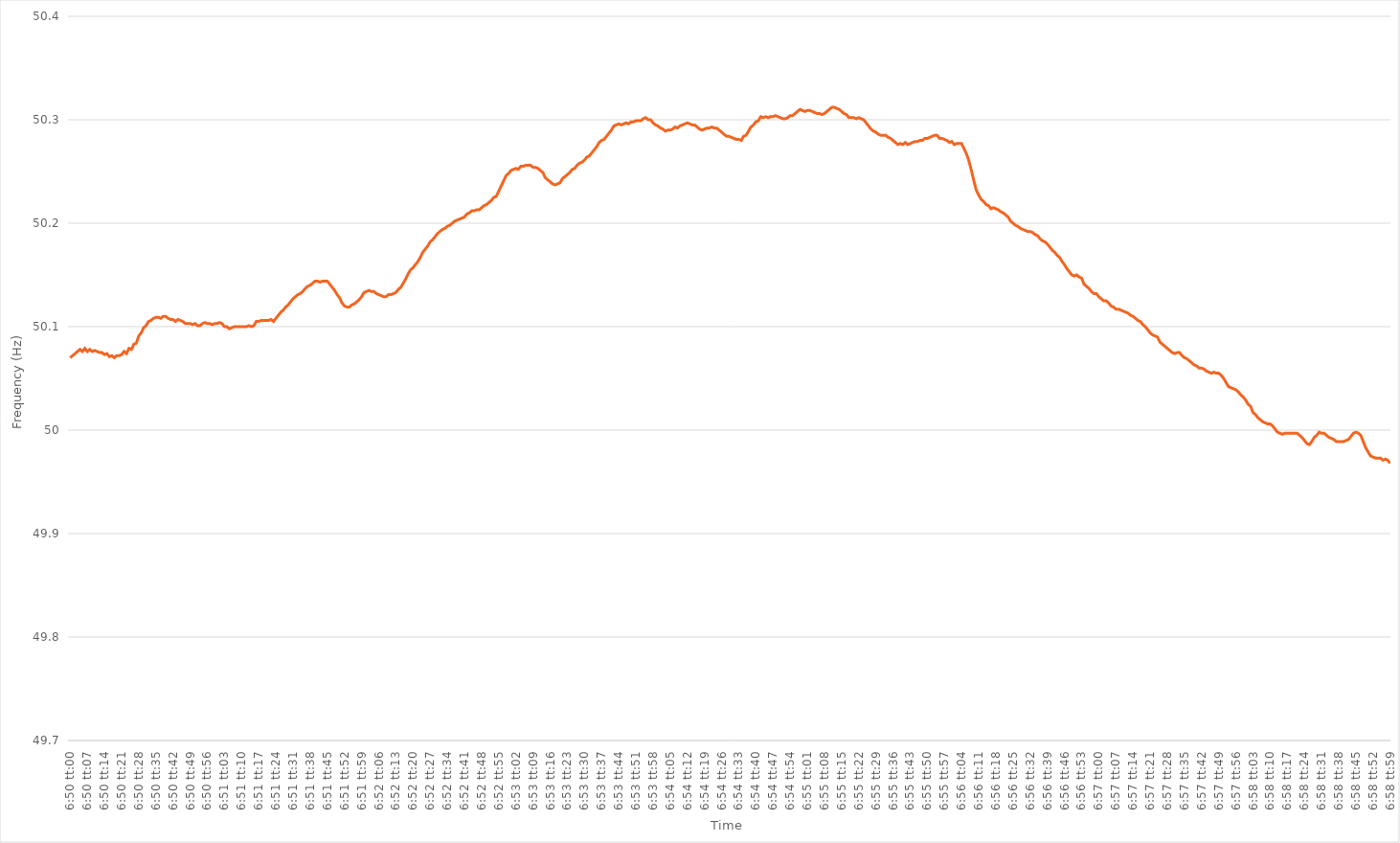
| Category | Series 0 |
|---|---|
| 0.2847222222222222 | 50.07 |
| 0.2847337962962963 | 50.072 |
| 0.28474537037037034 | 50.074 |
| 0.28475694444444444 | 50.076 |
| 0.28476851851851853 | 50.078 |
| 0.28478009259259257 | 50.076 |
| 0.28479166666666667 | 50.079 |
| 0.28480324074074076 | 50.076 |
| 0.2848148148148148 | 50.078 |
| 0.2848263888888889 | 50.076 |
| 0.284837962962963 | 50.077 |
| 0.284849537037037 | 50.076 |
| 0.2848611111111111 | 50.075 |
| 0.2848726851851852 | 50.075 |
| 0.28488425925925925 | 50.073 |
| 0.28489583333333335 | 50.074 |
| 0.2849074074074074 | 50.071 |
| 0.2849189814814815 | 50.072 |
| 0.2849305555555555 | 50.07 |
| 0.28494212962962967 | 50.072 |
| 0.2849537037037037 | 50.072 |
| 0.28496527777777775 | 50.073 |
| 0.28497685185185184 | 50.076 |
| 0.28498842592592594 | 50.074 |
| 0.285 | 50.079 |
| 0.28501157407407407 | 50.078 |
| 0.28502314814814816 | 50.083 |
| 0.2850347222222222 | 50.084 |
| 0.2850462962962963 | 50.091 |
| 0.2850578703703704 | 50.094 |
| 0.28506944444444443 | 50.099 |
| 0.2850810185185185 | 50.101 |
| 0.2850925925925926 | 50.105 |
| 0.28510416666666666 | 50.106 |
| 0.28511574074074075 | 50.108 |
| 0.28512731481481485 | 50.109 |
| 0.2851388888888889 | 50.109 |
| 0.2851504629629629 | 50.108 |
| 0.2851620370370371 | 50.11 |
| 0.2851736111111111 | 50.11 |
| 0.28518518518518515 | 50.108 |
| 0.28519675925925925 | 50.107 |
| 0.28520833333333334 | 50.107 |
| 0.2852199074074074 | 50.105 |
| 0.2852314814814815 | 50.107 |
| 0.28524305555555557 | 50.106 |
| 0.2852546296296296 | 50.105 |
| 0.2852662037037037 | 50.103 |
| 0.2852777777777778 | 50.103 |
| 0.28528935185185184 | 50.103 |
| 0.28530092592592593 | 50.102 |
| 0.2853125 | 50.103 |
| 0.28532407407407406 | 50.101 |
| 0.28533564814814816 | 50.101 |
| 0.28534722222222225 | 50.103 |
| 0.2853587962962963 | 50.104 |
| 0.28537037037037033 | 50.103 |
| 0.2853819444444445 | 50.103 |
| 0.2853935185185185 | 50.102 |
| 0.2854050925925926 | 50.103 |
| 0.28541666666666665 | 50.103 |
| 0.28542824074074075 | 50.104 |
| 0.2854398148148148 | 50.103 |
| 0.2854513888888889 | 50.1 |
| 0.285462962962963 | 50.1 |
| 0.285474537037037 | 50.098 |
| 0.2854861111111111 | 50.099 |
| 0.2854976851851852 | 50.1 |
| 0.28550925925925924 | 50.1 |
| 0.28552083333333333 | 50.1 |
| 0.28553240740740743 | 50.1 |
| 0.28554398148148147 | 50.1 |
| 0.28555555555555556 | 50.1 |
| 0.28556712962962966 | 50.101 |
| 0.2855787037037037 | 50.1 |
| 0.2855902777777778 | 50.101 |
| 0.2856018518518519 | 50.105 |
| 0.2856134259259259 | 50.105 |
| 0.285625 | 50.106 |
| 0.28563657407407406 | 50.106 |
| 0.28564814814814815 | 50.106 |
| 0.2856597222222222 | 50.106 |
| 0.2856712962962963 | 50.107 |
| 0.2856828703703704 | 50.105 |
| 0.2856944444444444 | 50.108 |
| 0.2857060185185185 | 50.111 |
| 0.2857175925925926 | 50.114 |
| 0.28572916666666665 | 50.116 |
| 0.28574074074074074 | 50.119 |
| 0.28575231481481483 | 50.121 |
| 0.2857638888888889 | 50.124 |
| 0.28577546296296297 | 50.127 |
| 0.28578703703703706 | 50.129 |
| 0.2857986111111111 | 50.131 |
| 0.2858101851851852 | 50.132 |
| 0.2858217592592593 | 50.134 |
| 0.28583333333333333 | 50.137 |
| 0.2858449074074074 | 50.139 |
| 0.28585648148148146 | 50.14 |
| 0.28586805555555556 | 50.142 |
| 0.2858796296296296 | 50.144 |
| 0.2858912037037037 | 50.144 |
| 0.2859027777777778 | 50.143 |
| 0.2859143518518518 | 50.144 |
| 0.2859259259259259 | 50.144 |
| 0.2859375 | 50.144 |
| 0.28594907407407405 | 50.141 |
| 0.28596064814814814 | 50.138 |
| 0.28597222222222224 | 50.135 |
| 0.2859837962962963 | 50.131 |
| 0.28599537037037037 | 50.128 |
| 0.28600694444444447 | 50.123 |
| 0.2860185185185185 | 50.12 |
| 0.2860300925925926 | 50.119 |
| 0.2860416666666667 | 50.119 |
| 0.28605324074074073 | 50.121 |
| 0.2860648148148148 | 50.122 |
| 0.2860763888888889 | 50.124 |
| 0.28608796296296296 | 50.126 |
| 0.286099537037037 | 50.129 |
| 0.28611111111111115 | 50.133 |
| 0.2861226851851852 | 50.134 |
| 0.2861342592592592 | 50.135 |
| 0.2861458333333333 | 50.134 |
| 0.2861574074074074 | 50.134 |
| 0.28616898148148145 | 50.132 |
| 0.28618055555555555 | 50.131 |
| 0.28619212962962964 | 50.13 |
| 0.2862037037037037 | 50.129 |
| 0.2862152777777778 | 50.129 |
| 0.28622685185185187 | 50.131 |
| 0.2862384259259259 | 50.131 |
| 0.28625 | 50.132 |
| 0.2862615740740741 | 50.133 |
| 0.28627314814814814 | 50.136 |
| 0.28628472222222223 | 50.138 |
| 0.2862962962962963 | 50.142 |
| 0.28630787037037037 | 50.146 |
| 0.2863194444444444 | 50.151 |
| 0.28633101851851855 | 50.155 |
| 0.2863425925925926 | 50.157 |
| 0.2863541666666667 | 50.16 |
| 0.2863657407407407 | 50.163 |
| 0.2863773148148148 | 50.167 |
| 0.28638888888888886 | 50.172 |
| 0.28640046296296295 | 50.175 |
| 0.28641203703703705 | 50.178 |
| 0.2864236111111111 | 50.182 |
| 0.2864351851851852 | 50.184 |
| 0.2864467592592593 | 50.187 |
| 0.2864583333333333 | 50.19 |
| 0.2864699074074074 | 50.192 |
| 0.2864814814814815 | 50.194 |
| 0.28649305555555554 | 50.195 |
| 0.28650462962962964 | 50.197 |
| 0.28651620370370373 | 50.198 |
| 0.28652777777777777 | 50.2 |
| 0.28653935185185186 | 50.202 |
| 0.28655092592592596 | 50.203 |
| 0.2865625 | 50.204 |
| 0.2865740740740741 | 50.205 |
| 0.28658564814814813 | 50.206 |
| 0.2865972222222222 | 50.209 |
| 0.28660879629629626 | 50.21 |
| 0.28662037037037036 | 50.212 |
| 0.28663194444444445 | 50.212 |
| 0.2866435185185185 | 50.213 |
| 0.2866550925925926 | 50.213 |
| 0.2866666666666667 | 50.215 |
| 0.2866782407407407 | 50.217 |
| 0.2866898148148148 | 50.218 |
| 0.2867013888888889 | 50.22 |
| 0.28671296296296295 | 50.222 |
| 0.28672453703703704 | 50.225 |
| 0.28673611111111114 | 50.226 |
| 0.2867476851851852 | 50.231 |
| 0.28675925925925927 | 50.236 |
| 0.28677083333333336 | 50.241 |
| 0.2867824074074074 | 50.246 |
| 0.2867939814814815 | 50.248 |
| 0.28680555555555554 | 50.251 |
| 0.28681712962962963 | 50.252 |
| 0.28682870370370367 | 50.253 |
| 0.28684027777777776 | 50.252 |
| 0.28685185185185186 | 50.255 |
| 0.2868634259259259 | 50.255 |
| 0.286875 | 50.256 |
| 0.2868865740740741 | 50.256 |
| 0.2868981481481481 | 50.256 |
| 0.2869097222222222 | 50.254 |
| 0.2869212962962963 | 50.254 |
| 0.28693287037037035 | 50.253 |
| 0.28694444444444445 | 50.251 |
| 0.28695601851851854 | 50.249 |
| 0.2869675925925926 | 50.244 |
| 0.2869791666666667 | 50.242 |
| 0.28699074074074077 | 50.24 |
| 0.2870023148148148 | 50.238 |
| 0.2870138888888889 | 50.237 |
| 0.287025462962963 | 50.238 |
| 0.28703703703703703 | 50.239 |
| 0.2870486111111111 | 50.243 |
| 0.2870601851851852 | 50.245 |
| 0.28707175925925926 | 50.247 |
| 0.2870833333333333 | 50.249 |
| 0.2870949074074074 | 50.252 |
| 0.2871064814814815 | 50.253 |
| 0.28711805555555553 | 50.256 |
| 0.2871296296296296 | 50.258 |
| 0.2871412037037037 | 50.259 |
| 0.28715277777777776 | 50.261 |
| 0.28716435185185185 | 50.264 |
| 0.28717592592592595 | 50.265 |
| 0.2871875 | 50.268 |
| 0.2871990740740741 | 50.271 |
| 0.2872106481481482 | 50.274 |
| 0.2872222222222222 | 50.278 |
| 0.2872337962962963 | 50.28 |
| 0.2872453703703704 | 50.281 |
| 0.28725694444444444 | 50.284 |
| 0.2872685185185185 | 50.287 |
| 0.28728009259259263 | 50.29 |
| 0.28729166666666667 | 50.294 |
| 0.28730324074074076 | 50.295 |
| 0.2873148148148148 | 50.296 |
| 0.2873263888888889 | 50.295 |
| 0.28733796296296293 | 50.296 |
| 0.28734953703703703 | 50.297 |
| 0.2873611111111111 | 50.296 |
| 0.28737268518518516 | 50.298 |
| 0.28738425925925926 | 50.298 |
| 0.28739583333333335 | 50.299 |
| 0.2874074074074074 | 50.299 |
| 0.2874189814814815 | 50.299 |
| 0.2874305555555556 | 50.301 |
| 0.2874421296296296 | 50.302 |
| 0.2874537037037037 | 50.3 |
| 0.2874652777777778 | 50.3 |
| 0.28747685185185184 | 50.297 |
| 0.28748842592592594 | 50.295 |
| 0.28750000000000003 | 50.294 |
| 0.28751157407407407 | 50.292 |
| 0.28752314814814817 | 50.291 |
| 0.2875347222222222 | 50.289 |
| 0.2875462962962963 | 50.29 |
| 0.28755787037037034 | 50.29 |
| 0.28756944444444443 | 50.291 |
| 0.2875810185185185 | 50.293 |
| 0.28759259259259257 | 50.292 |
| 0.28760416666666666 | 50.294 |
| 0.28761574074074076 | 50.295 |
| 0.2876273148148148 | 50.296 |
| 0.2876388888888889 | 50.297 |
| 0.287650462962963 | 50.296 |
| 0.287662037037037 | 50.295 |
| 0.2876736111111111 | 50.295 |
| 0.2876851851851852 | 50.293 |
| 0.28769675925925925 | 50.291 |
| 0.28770833333333334 | 50.29 |
| 0.28771990740740744 | 50.291 |
| 0.2877314814814815 | 50.292 |
| 0.28774305555555557 | 50.292 |
| 0.2877546296296296 | 50.293 |
| 0.2877662037037037 | 50.292 |
| 0.28777777777777774 | 50.292 |
| 0.28778935185185184 | 50.29 |
| 0.28780092592592593 | 50.288 |
| 0.28781249999999997 | 50.286 |
| 0.28782407407407407 | 50.284 |
| 0.28783564814814816 | 50.284 |
| 0.2878472222222222 | 50.283 |
| 0.2878587962962963 | 50.282 |
| 0.2878703703703704 | 50.281 |
| 0.2878819444444444 | 50.281 |
| 0.2878935185185185 | 50.28 |
| 0.2879050925925926 | 50.284 |
| 0.28791666666666665 | 50.285 |
| 0.28792824074074075 | 50.289 |
| 0.28793981481481484 | 50.293 |
| 0.2879513888888889 | 50.295 |
| 0.287962962962963 | 50.298 |
| 0.287974537037037 | 50.299 |
| 0.2879861111111111 | 50.303 |
| 0.28799768518518515 | 50.302 |
| 0.2880092592592593 | 50.303 |
| 0.28802083333333334 | 50.302 |
| 0.2880324074074074 | 50.303 |
| 0.28804398148148147 | 50.303 |
| 0.28805555555555556 | 50.304 |
| 0.2880671296296296 | 50.303 |
| 0.2880787037037037 | 50.302 |
| 0.2880902777777778 | 50.301 |
| 0.28810185185185183 | 50.301 |
| 0.2881134259259259 | 50.302 |
| 0.288125 | 50.304 |
| 0.28813657407407406 | 50.304 |
| 0.28814814814814815 | 50.306 |
| 0.28815972222222225 | 50.308 |
| 0.2881712962962963 | 50.31 |
| 0.2881828703703704 | 50.309 |
| 0.2881944444444445 | 50.308 |
| 0.2882060185185185 | 50.309 |
| 0.28821759259259255 | 50.309 |
| 0.2882291666666667 | 50.308 |
| 0.28824074074074074 | 50.307 |
| 0.28825231481481484 | 50.306 |
| 0.2882638888888889 | 50.306 |
| 0.28827546296296297 | 50.305 |
| 0.288287037037037 | 50.306 |
| 0.2882986111111111 | 50.308 |
| 0.2883101851851852 | 50.31 |
| 0.28832175925925924 | 50.312 |
| 0.28833333333333333 | 50.312 |
| 0.2883449074074074 | 50.311 |
| 0.28835648148148146 | 50.31 |
| 0.28836805555555556 | 50.308 |
| 0.28837962962962965 | 50.306 |
| 0.2883912037037037 | 50.305 |
| 0.2884027777777778 | 50.302 |
| 0.2884143518518519 | 50.302 |
| 0.2884259259259259 | 50.302 |
| 0.2884375 | 50.301 |
| 0.2884490740740741 | 50.302 |
| 0.28846064814814815 | 50.301 |
| 0.28847222222222224 | 50.3 |
| 0.2884837962962963 | 50.297 |
| 0.2884953703703704 | 50.294 |
| 0.2885069444444444 | 50.291 |
| 0.2885185185185185 | 50.289 |
| 0.2885300925925926 | 50.288 |
| 0.28854166666666664 | 50.286 |
| 0.28855324074074074 | 50.285 |
| 0.28856481481481483 | 50.285 |
| 0.28857638888888887 | 50.285 |
| 0.28858796296296296 | 50.283 |
| 0.28859953703703706 | 50.282 |
| 0.2886111111111111 | 50.28 |
| 0.2886226851851852 | 50.278 |
| 0.2886342592592593 | 50.276 |
| 0.2886458333333333 | 50.277 |
| 0.2886574074074074 | 50.276 |
| 0.2886689814814815 | 50.278 |
| 0.28868055555555555 | 50.276 |
| 0.28869212962962965 | 50.277 |
| 0.2887037037037037 | 50.278 |
| 0.2887152777777778 | 50.279 |
| 0.2887268518518518 | 50.279 |
| 0.2887384259259259 | 50.28 |
| 0.28875 | 50.28 |
| 0.28876157407407405 | 50.282 |
| 0.28877314814814814 | 50.282 |
| 0.28878472222222223 | 50.283 |
| 0.2887962962962963 | 50.284 |
| 0.28880787037037037 | 50.285 |
| 0.28881944444444446 | 50.285 |
| 0.2888310185185185 | 50.282 |
| 0.2888425925925926 | 50.282 |
| 0.2888541666666667 | 50.281 |
| 0.28886574074074073 | 50.28 |
| 0.2888773148148148 | 50.278 |
| 0.2888888888888889 | 50.279 |
| 0.28890046296296296 | 50.276 |
| 0.28891203703703705 | 50.277 |
| 0.2889236111111111 | 50.277 |
| 0.2889351851851852 | 50.277 |
| 0.2889467592592592 | 50.272 |
| 0.2889583333333334 | 50.267 |
| 0.2889699074074074 | 50.26 |
| 0.28898148148148145 | 50.251 |
| 0.28899305555555554 | 50.241 |
| 0.28900462962962964 | 50.232 |
| 0.2890162037037037 | 50.227 |
| 0.2890277777777778 | 50.223 |
| 0.28903935185185187 | 50.221 |
| 0.2890509259259259 | 50.218 |
| 0.2890625 | 50.217 |
| 0.2890740740740741 | 50.214 |
| 0.28908564814814813 | 50.215 |
| 0.2890972222222222 | 50.214 |
| 0.2891087962962963 | 50.213 |
| 0.28912037037037036 | 50.211 |
| 0.28913194444444446 | 50.21 |
| 0.28914351851851855 | 50.208 |
| 0.2891550925925926 | 50.206 |
| 0.2891666666666666 | 50.202 |
| 0.2891782407407408 | 50.2 |
| 0.2891898148148148 | 50.198 |
| 0.2892013888888889 | 50.197 |
| 0.28921296296296295 | 50.195 |
| 0.28922453703703704 | 50.194 |
| 0.2892361111111111 | 50.193 |
| 0.2892476851851852 | 50.192 |
| 0.28925925925925927 | 50.192 |
| 0.2892708333333333 | 50.191 |
| 0.2892824074074074 | 50.189 |
| 0.2892939814814815 | 50.188 |
| 0.28930555555555554 | 50.185 |
| 0.28931712962962963 | 50.183 |
| 0.2893287037037037 | 50.182 |
| 0.28934027777777777 | 50.18 |
| 0.28935185185185186 | 50.177 |
| 0.28936342592592595 | 50.174 |
| 0.289375 | 50.172 |
| 0.2893865740740741 | 50.169 |
| 0.2893981481481482 | 50.167 |
| 0.2894097222222222 | 50.163 |
| 0.2894212962962963 | 50.16 |
| 0.28943287037037035 | 50.156 |
| 0.28944444444444445 | 50.153 |
| 0.2894560185185185 | 50.15 |
| 0.2894675925925926 | 50.149 |
| 0.2894791666666667 | 50.15 |
| 0.2894907407407407 | 50.148 |
| 0.2895023148148148 | 50.147 |
| 0.2895138888888889 | 50.141 |
| 0.28952546296296294 | 50.139 |
| 0.28953703703703704 | 50.137 |
| 0.28954861111111113 | 50.134 |
| 0.28956018518518517 | 50.132 |
| 0.28957175925925926 | 50.132 |
| 0.28958333333333336 | 50.129 |
| 0.2895949074074074 | 50.127 |
| 0.2896064814814815 | 50.125 |
| 0.2896180555555556 | 50.125 |
| 0.2896296296296296 | 50.123 |
| 0.2896412037037037 | 50.12 |
| 0.28965277777777776 | 50.119 |
| 0.28966435185185185 | 50.117 |
| 0.2896759259259259 | 50.117 |
| 0.2896875 | 50.116 |
| 0.2896990740740741 | 50.115 |
| 0.2897106481481481 | 50.114 |
| 0.2897222222222222 | 50.113 |
| 0.2897337962962963 | 50.111 |
| 0.28974537037037035 | 50.11 |
| 0.28975694444444444 | 50.108 |
| 0.28976851851851854 | 50.106 |
| 0.2897800925925926 | 50.105 |
| 0.28979166666666667 | 50.102 |
| 0.28980324074074076 | 50.1 |
| 0.2898148148148148 | 50.097 |
| 0.2898263888888889 | 50.094 |
| 0.289837962962963 | 50.092 |
| 0.28984953703703703 | 50.091 |
| 0.2898611111111111 | 50.09 |
| 0.28987268518518516 | 50.085 |
| 0.28988425925925926 | 50.083 |
| 0.2898958333333333 | 50.081 |
| 0.28990740740740745 | 50.079 |
| 0.2899189814814815 | 50.077 |
| 0.2899305555555555 | 50.075 |
| 0.2899421296296296 | 50.074 |
| 0.2899537037037037 | 50.075 |
| 0.28996527777777775 | 50.075 |
| 0.28997685185185185 | 50.072 |
| 0.28998842592592594 | 50.07 |
| 0.29 | 50.069 |
| 0.2900115740740741 | 50.067 |
| 0.29002314814814817 | 50.065 |
| 0.2900347222222222 | 50.063 |
| 0.2900462962962963 | 50.062 |
| 0.2900578703703704 | 50.06 |
| 0.29006944444444444 | 50.06 |
| 0.29008101851851853 | 50.059 |
| 0.2900925925925926 | 50.057 |
| 0.29010416666666666 | 50.056 |
| 0.2901157407407407 | 50.055 |
| 0.29012731481481485 | 50.056 |
| 0.2901388888888889 | 50.055 |
| 0.290150462962963 | 50.055 |
| 0.290162037037037 | 50.053 |
| 0.2901736111111111 | 50.05 |
| 0.29018518518518516 | 50.046 |
| 0.29019675925925925 | 50.042 |
| 0.29020833333333335 | 50.041 |
| 0.2902199074074074 | 50.04 |
| 0.2902314814814815 | 50.039 |
| 0.2902430555555556 | 50.037 |
| 0.2902546296296296 | 50.034 |
| 0.2902662037037037 | 50.032 |
| 0.2902777777777778 | 50.029 |
| 0.29028935185185184 | 50.025 |
| 0.29030092592592593 | 50.023 |
| 0.29031250000000003 | 50.017 |
| 0.29032407407407407 | 50.015 |
| 0.29033564814814816 | 50.012 |
| 0.29034722222222226 | 50.01 |
| 0.2903587962962963 | 50.008 |
| 0.2903703703703704 | 50.007 |
| 0.29038194444444443 | 50.006 |
| 0.2903935185185185 | 50.006 |
| 0.29040509259259256 | 50.004 |
| 0.29041666666666666 | 50.001 |
| 0.29042824074074075 | 49.998 |
| 0.2904398148148148 | 49.997 |
| 0.2904513888888889 | 49.996 |
| 0.290462962962963 | 49.997 |
| 0.290474537037037 | 49.997 |
| 0.2904861111111111 | 49.997 |
| 0.2904976851851852 | 49.997 |
| 0.29050925925925924 | 49.997 |
| 0.29052083333333334 | 49.997 |
| 0.29053240740740743 | 49.995 |
| 0.2905439814814815 | 49.993 |
| 0.29055555555555557 | 49.99 |
| 0.29056712962962966 | 49.987 |
| 0.2905787037037037 | 49.986 |
| 0.2905902777777778 | 49.989 |
| 0.29060185185185183 | 49.993 |
| 0.29061342592592593 | 49.995 |
| 0.29062499999999997 | 49.998 |
| 0.29063657407407406 | 49.997 |
| 0.29064814814814816 | 49.997 |
| 0.2906597222222222 | 49.995 |
| 0.2906712962962963 | 49.993 |
| 0.2906828703703704 | 49.992 |
| 0.2906944444444444 | 49.991 |
| 0.2907060185185185 | 49.989 |
| 0.2907175925925926 | 49.989 |
| 0.29072916666666665 | 49.989 |
| 0.29074074074074074 | 49.989 |
| 0.29075231481481484 | 49.99 |
| 0.2907638888888889 | 49.991 |
| 0.29077546296296297 | 49.994 |
| 0.29078703703703707 | 49.997 |
| 0.2907986111111111 | 49.998 |
| 0.2908101851851852 | 49.997 |
| 0.29082175925925924 | 49.995 |
| 0.29083333333333333 | 49.989 |
| 0.29084490740740737 | 49.983 |
| 0.2908564814814815 | 49.979 |
| 0.29086805555555556 | 49.975 |
| 0.2908796296296296 | 49.974 |
| 0.2908912037037037 | 49.973 |
| 0.2909027777777778 | 49.973 |
| 0.2909143518518518 | 49.973 |
| 0.2909259259259259 | 49.971 |
| 0.2909375 | 49.972 |
| 0.29094907407407405 | 49.971 |
| 0.29096064814814815 | 49.968 |